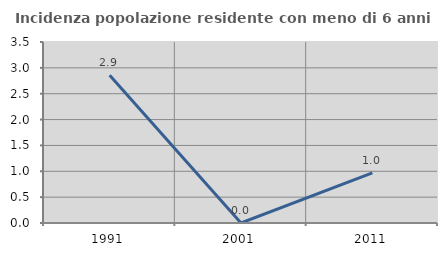
| Category | Incidenza popolazione residente con meno di 6 anni |
|---|---|
| 1991.0 | 2.857 |
| 2001.0 | 0 |
| 2011.0 | 0.971 |